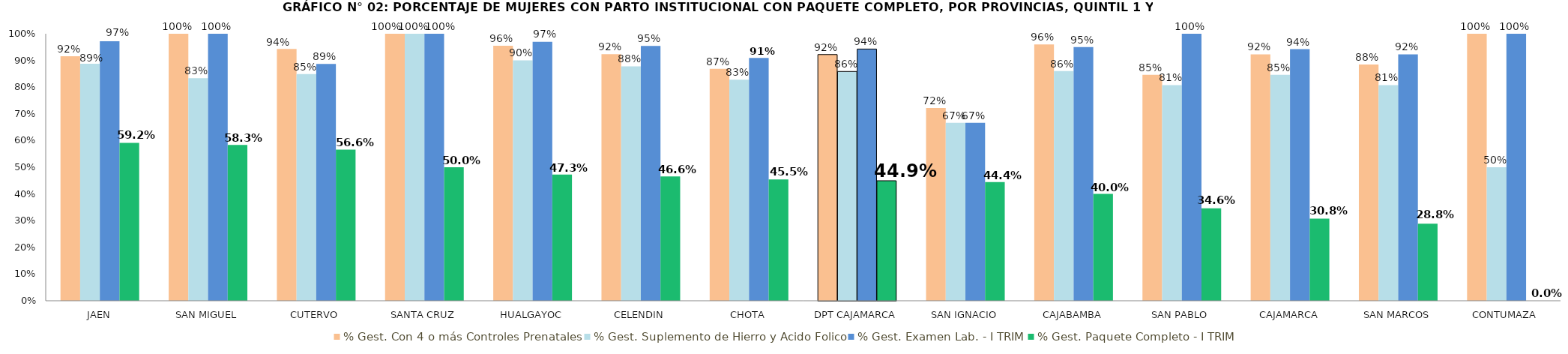
| Category | % Gest. Con 4 o más Controles Prenatales | % Gest. Suplemento de Hierro y Acido Folico | % Gest. Examen Lab. - I TRIM | % Gest. Paquete Completo - I TRIM |
|---|---|---|---|---|
| JAEN | 0.915 | 0.887 | 0.972 | 0.592 |
| SAN MIGUEL | 1 | 0.833 | 1 | 0.583 |
| CUTERVO | 0.943 | 0.849 | 0.887 | 0.566 |
| SANTA CRUZ | 1 | 1 | 1 | 0.5 |
| HUALGAYOC | 0.955 | 0.9 | 0.97 | 0.473 |
| CELENDIN | 0.924 | 0.878 | 0.954 | 0.466 |
| CHOTA | 0.869 | 0.828 | 0.909 | 0.455 |
| DPT CAJAMARCA | 0.922 | 0.859 | 0.943 | 0.449 |
| SAN IGNACIO | 0.722 | 0.667 | 0.667 | 0.444 |
| CAJABAMBA | 0.96 | 0.86 | 0.95 | 0.4 |
| SAN PABLO | 0.846 | 0.808 | 1 | 0.346 |
| CAJAMARCA | 0.923 | 0.846 | 0.942 | 0.308 |
| SAN MARCOS | 0.885 | 0.808 | 0.923 | 0.288 |
| CONTUMAZA | 1 | 0.5 | 1 | 0 |